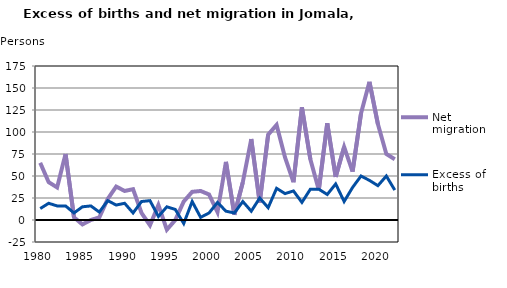
| Category | Net migration | Excess of births |
|---|---|---|
| 1980.0 | 65 | 13 |
| 1981.0 | 43 | 19 |
| 1982.0 | 37 | 16 |
| 1983.0 | 75 | 16 |
| 1984.0 | 3 | 8 |
| 1985.0 | -5 | 15 |
| 1986.0 | 0 | 16 |
| 1987.0 | 3 | 9 |
| 1988.0 | 24 | 22 |
| 1989.0 | 38 | 17 |
| 1990.0 | 33 | 19 |
| 1991.0 | 35 | 8 |
| 1992.0 | 8 | 21 |
| 1993.0 | -6 | 22 |
| 1994.0 | 17 | 4 |
| 1995.0 | -11 | 15 |
| 1996.0 | 0 | 12 |
| 1997.0 | 21 | -4 |
| 1998.0 | 32 | 21 |
| 1999.0 | 33 | 3 |
| 2000.0 | 29 | 8 |
| 2001.0 | 9 | 20 |
| 2002.0 | 66 | 10 |
| 2003.0 | 6 | 8 |
| 2004.0 | 43 | 21 |
| 2005.0 | 92 | 10 |
| 2006.0 | 20 | 25 |
| 2007.0 | 97 | 14 |
| 2008.0 | 108 | 36 |
| 2009.0 | 71 | 30 |
| 2010.0 | 43 | 33 |
| 2011.0 | 128 | 20 |
| 2012.0 | 69 | 35 |
| 2013.0 | 34 | 35 |
| 2014.0 | 110 | 29 |
| 2015.0 | 49 | 41 |
| 2016.0 | 83 | 21 |
| 2017.0 | 55 | 37 |
| 2018.0 | 121 | 50 |
| 2019.0 | 157 | 45 |
| 2020.0 | 109 | 39 |
| 2021.0 | 75 | 50 |
| 2022.0 | 69 | 34 |